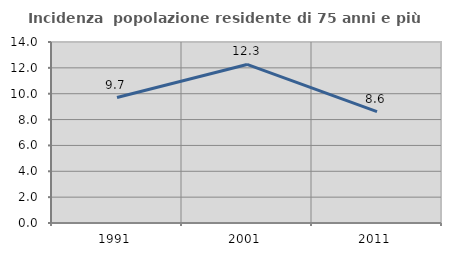
| Category | Incidenza  popolazione residente di 75 anni e più |
|---|---|
| 1991.0 | 9.706 |
| 2001.0 | 12.265 |
| 2011.0 | 8.614 |